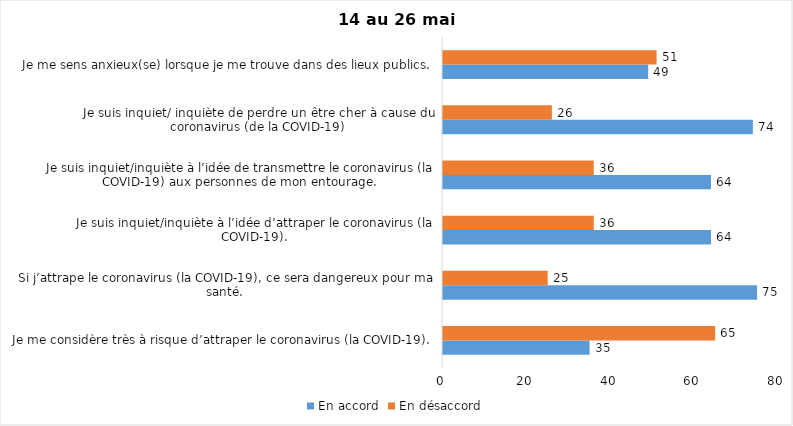
| Category | En accord | En désaccord |
|---|---|---|
| Je me considère très à risque d’attraper le coronavirus (la COVID-19). | 35 | 65 |
| Si j’attrape le coronavirus (la COVID-19), ce sera dangereux pour ma santé. | 75 | 25 |
| Je suis inquiet/inquiète à l’idée d’attraper le coronavirus (la COVID-19). | 64 | 36 |
| Je suis inquiet/inquiète à l’idée de transmettre le coronavirus (la COVID-19) aux personnes de mon entourage. | 64 | 36 |
| Je suis inquiet/ inquiète de perdre un être cher à cause du coronavirus (de la COVID-19) | 74 | 26 |
| Je me sens anxieux(se) lorsque je me trouve dans des lieux publics. | 49 | 51 |